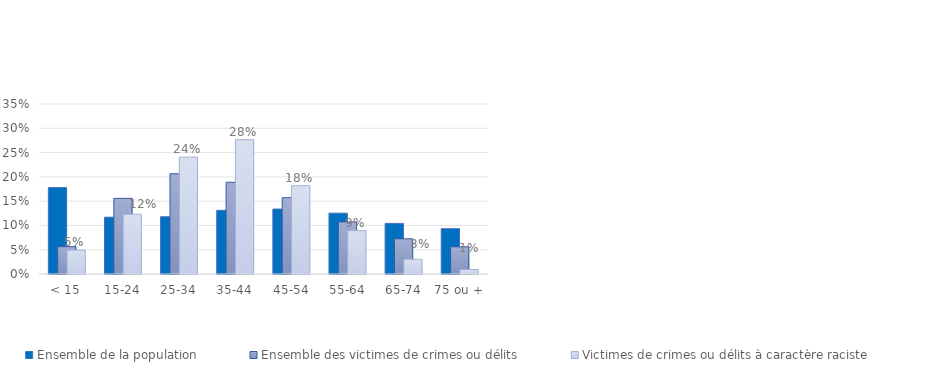
| Category | Ensemble de la population | Ensemble des victimes de crimes ou délits | Victimes de crimes ou délits à caractère raciste |
|---|---|---|---|
| < 15 | 0.178 | 0.056 | 0.049 |
| 15-24 | 0.117 | 0.156 | 0.123 |
| 25-34 | 0.118 | 0.206 | 0.241 |
| 35-44 | 0.131 | 0.189 | 0.277 |
| 45-54 | 0.134 | 0.157 | 0.182 |
| 55-64 | 0.125 | 0.107 | 0.089 |
| 65-74 | 0.104 | 0.072 | 0.03 |
| 75 ou + | 0.093 | 0.056 | 0.009 |